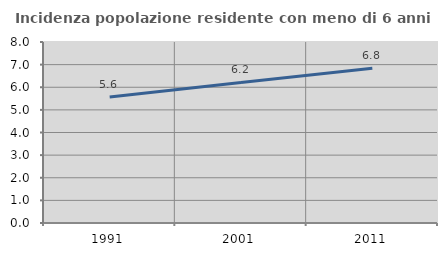
| Category | Incidenza popolazione residente con meno di 6 anni |
|---|---|
| 1991.0 | 5.573 |
| 2001.0 | 6.213 |
| 2011.0 | 6.843 |